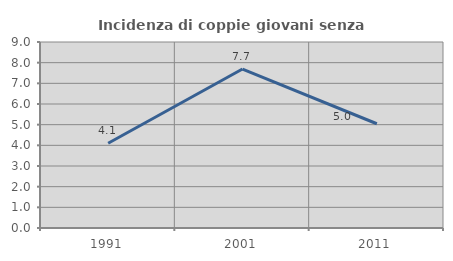
| Category | Incidenza di coppie giovani senza figli |
|---|---|
| 1991.0 | 4.101 |
| 2001.0 | 7.692 |
| 2011.0 | 5.045 |